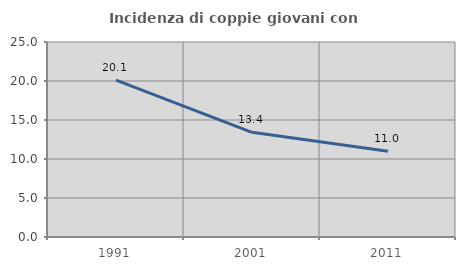
| Category | Incidenza di coppie giovani con figli |
|---|---|
| 1991.0 | 20.118 |
| 2001.0 | 13.423 |
| 2011.0 | 10.986 |